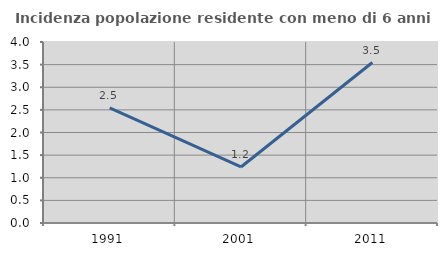
| Category | Incidenza popolazione residente con meno di 6 anni |
|---|---|
| 1991.0 | 2.545 |
| 2001.0 | 1.238 |
| 2011.0 | 3.546 |